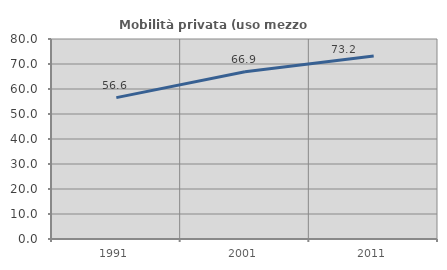
| Category | Mobilità privata (uso mezzo privato) |
|---|---|
| 1991.0 | 56.551 |
| 2001.0 | 66.889 |
| 2011.0 | 73.172 |